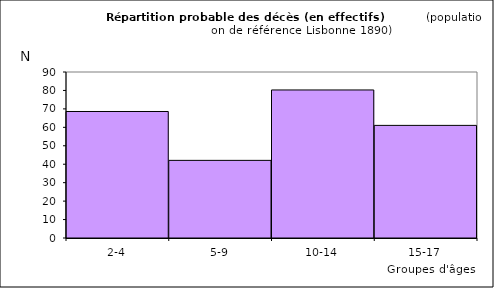
| Category | Series 0 |
|---|---|
| 2-4 | 68.592 |
| 5-9 | 42.086 |
| 10-14 | 80.265 |
| 15-17 | 61.057 |